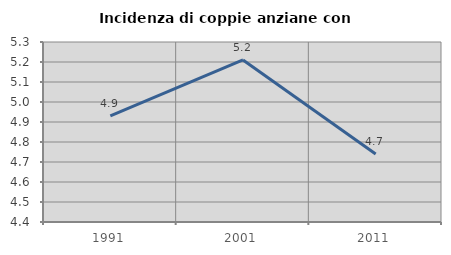
| Category | Incidenza di coppie anziane con figli |
|---|---|
| 1991.0 | 4.931 |
| 2001.0 | 5.21 |
| 2011.0 | 4.74 |